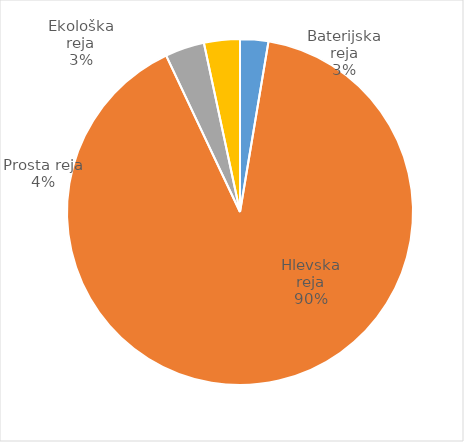
| Category | Število kosov jajc |
|---|---|
| Baterijska reja | 74200 |
| Hlevska reja | 2544150 |
| Prosta reja | 103287 |
| Ekološka reja | 94380 |